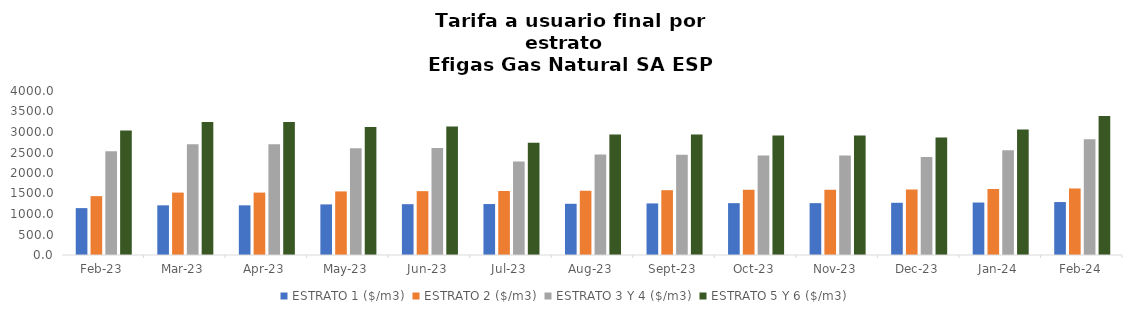
| Category | ESTRATO 1 ($/m3) | ESTRATO 2 ($/m3) | ESTRATO 3 Y 4 ($/m3) | ESTRATO 5 Y 6 ($/m3) |
|---|---|---|---|---|
| 2023-02-01 | 1143.48 | 1435.53 | 2531 | 3037.2 |
| 2023-03-01 | 1211.66 | 1522.37 | 2701.57 | 3241.884 |
| 2023-04-01 | 1211.66 | 1522.37 | 2701.57 | 3241.884 |
| 2023-05-01 | 1233.96 | 1550.39 | 2603.83 | 3124.596 |
| 2023-06-01 | 1239.35 | 1557.16 | 2610.15 | 3132.18 |
| 2023-07-01 | 1243.07 | 1561.83 | 2281.753 | 2738.104 |
| 2023-08-01 | 1249.3 | 1569.65 | 2451.116 | 2941.34 |
| 2023-09-01 | 1258.03 | 1580.63 | 2447.703 | 2937.244 |
| 2023-10-01 | 1264.72 | 1589.03 | 2427.174 | 2912.609 |
| 2023-11-01 | 1264.72 | 1589.03 | 2427.174 | 2912.609 |
| 2023-12-01 | 1273.83 | 1600.47 | 2388.722 | 2866.466 |
| 2024-01-01 | 1279.68 | 1607.83 | 2553.12 | 3063.744 |
| 2024-02-01 | 1291.39 | 1622.54 | 2824.404 | 3389.285 |